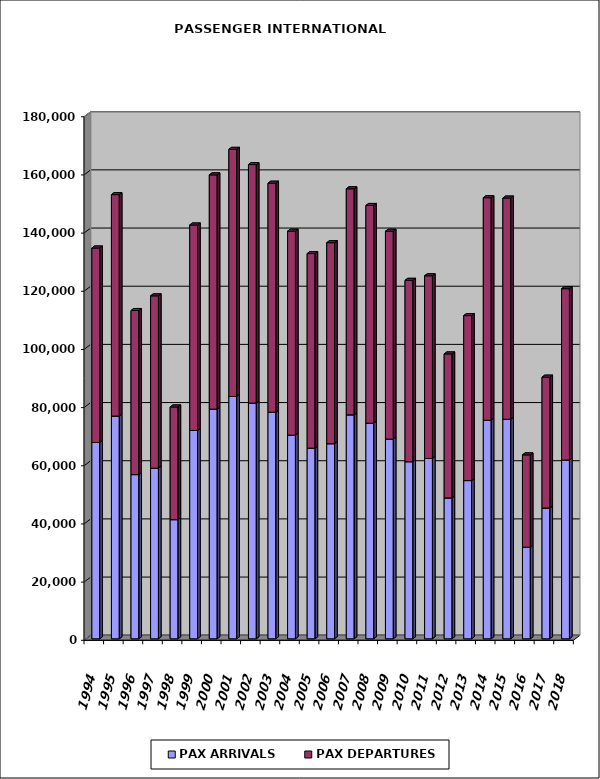
| Category | PAX ARRIVALS | PAX DEPARTURES |
|---|---|---|
| 1994.0 | 67481 | 66863 |
| 1995.0 | 76576 | 76126 |
| 1996.0 | 56456 | 56409 |
| 1997.0 | 58654 | 59244 |
| 1998.0 | 40969 | 38739 |
| 1999.0 | 71636 | 70632 |
| 2000.0 | 78965 | 80529 |
| 2001.0 | 83331 | 84936 |
| 2002.0 | 81045 | 81994 |
| 2003.0 | 77903 | 78735 |
| 2004.0 | 69995 | 70158 |
| 2005.0 | 65542 | 66893 |
| 2006.0 | 67078 | 69097 |
| 2007.0 | 77004 | 77704 |
| 2008.0 | 74151 | 74824 |
| 2009.0 | 68655 | 71480 |
| 2010.0 | 60882 | 62358 |
| 2011.0 | 62008 | 62792 |
| 2012.0 | 48435 | 49499 |
| 2013.0 | 54395 | 56724 |
| 2014.0 | 75139 | 76503 |
| 2015.0 | 75475 | 76049 |
| 2016.0 | 31480 | 31746 |
| 2017.0 | 44958 | 44996 |
| 2018.0 | 61457 | 58908 |